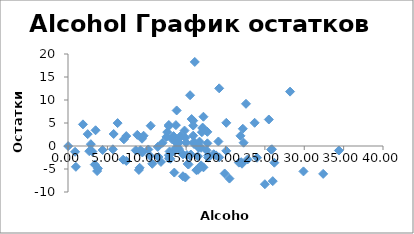
| Category | Series 0 |
|---|---|
| 0.02 | -0.022 |
| 13.4 | -1.191 |
| 14.6 | -1.823 |
| 13.4 | 2.155 |
| 14.9 | 1.807 |
| 3.7 | -5.448 |
| 22.1 | -3.849 |
| 0.9 | -1.263 |
| 15.9 | 5.508 |
| 16.3 | -5.243 |
| 1.9 | 4.705 |
| 10.5 | 4.411 |
| 26.2 | -3.629 |
| 19.2 | -2.474 |
| 22.2 | 3.744 |
| 23.7 | 5.046 |
| 17.0 | 3.002 |
| 21.7 | -3.615 |
| 22.6 | 9.174 |
| 13.8 | 0.639 |
| 8.8 | 2.421 |
| 13.7 | -0.427 |
| 12.9 | -1.187 |
| 15.2 | -3.898 |
| 22.3 | 0.717 |
| 7.1 | 1.456 |
| 15.1 | -1.96 |
| 13.0 | -2.787 |
| 15.0 | 0.703 |
| 13.2 | 1.499 |
| 19.1 | 0.979 |
| 13.9 | -0.299 |
| 2.7 | -1.125 |
| 16.0 | 0.437 |
| 9.5 | -1.331 |
| 12.8 | 4.336 |
| 15.5 | 11.037 |
| 6.3 | 4.977 |
| 15.9 | 4.446 |
| 34.4 | -0.981 |
| 12.6 | 3.021 |
| 16.9 | -4.206 |
| 14.8 | 3.353 |
| 16.7 | 0.952 |
| 17.2 | -4.638 |
| 14.1 | -0.679 |
| 16.9 | -0.393 |
| 10.2 | -0.754 |
| 9.0 | -5.21 |
| 5.8 | 2.611 |
| 16.5 | -2.219 |
| 16.1 | 18.273 |
| 16.5 | -0.189 |
| 13.5 | -5.776 |
| 17.1 | 4.007 |
| 12.8 | 4.567 |
| 3.4 | -4.034 |
| 16.0 | 0.878 |
| 7.0 | -2.969 |
| 19.2 | 12.536 |
| 9.6 | 2.232 |
| 1.0 | -4.525 |
| 24.0 | -2.549 |
| 25.9 | -0.713 |
| 17.2 | 6.365 |
| 25.0 | -8.305 |
| 28.2 | 11.817 |
| 14.1 | 0.726 |
| 9.2 | -0.927 |
| 15.5 | -2.071 |
| 3.1 | -1.214 |
| 5.7 | -0.719 |
| 12.8 | -2.72 |
| 11.5 | -2.394 |
| 15.3 | -4.024 |
| 21.9 | 2.213 |
| 11.4 | -0.198 |
| 17.6 | -0.953 |
| 32.4 | -6.063 |
| 7.4 | 2.157 |
| 12.0 | 0.705 |
| 14.3 | 2.174 |
| 15.9 | 2.247 |
| 2.5 | 2.579 |
| 25.5 | 5.761 |
| 9.4 | 1.582 |
| 9.1 | -4.738 |
| 26.0 | -7.639 |
| 16.5 | -5.179 |
| 8.6 | -0.945 |
| 20.1 | -1.048 |
| 11.8 | -3.462 |
| 19.9 | -5.975 |
| 17.1 | 3.804 |
| 17.8 | -2.033 |
| 4.4 | -0.867 |
| 18.8 | -2.032 |
| 20.1 | 5.043 |
| 3.8 | -4.867 |
| 3.5 | 3.418 |
| 18.5 | -1.783 |
| 2.9 | 0.396 |
| 16.6 | -0.323 |
| 17.7 | 3.077 |
| 10.4 | -2.145 |
| 29.9 | -5.52 |
| 14.6 | -6.579 |
| 22.0 | -3.52 |
| 12.5 | 1.98 |
| 14.2 | 1.783 |
| 25.8 | -0.785 |
| 10.7 | -3.866 |
| 17.8 | -2.533 |
| 13.8 | 7.727 |
| 20.5 | -7.082 |
| 15.6 | -1.854 |
| 13.7 | 4.536 |
| 15.7 | 5.858 |
| 12.8 | -2.007 |
| 7.4 | -3.256 |
| 14.9 | -6.84 |
| 22.8 | -2.926 |
| 9.4 | -1.356 |
| 17.7 | 0.58 |